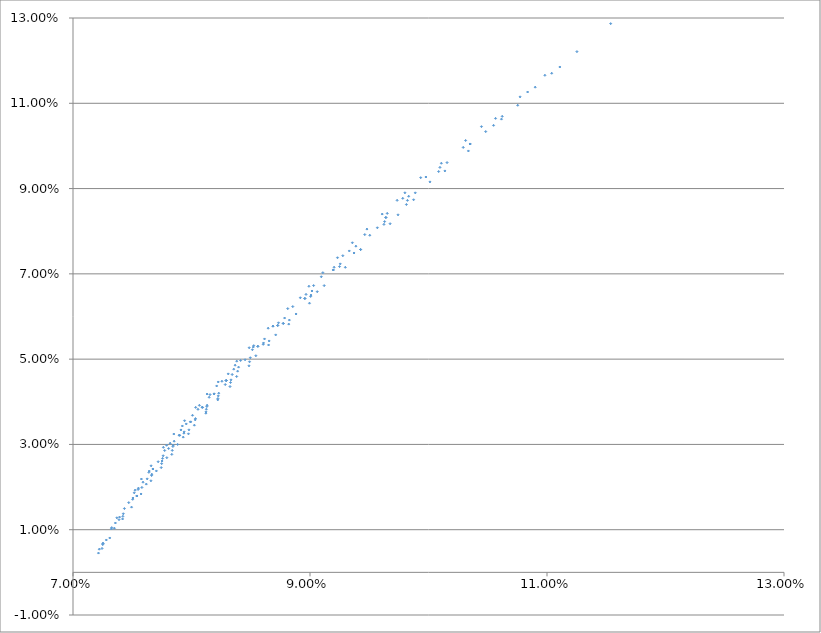
| Category | Series 0 |
|---|---|
| 0.07221803137671154 | 0.005 |
| 0.0735791200367572 | 0.012 |
| 0.07552028197854009 | 0.02 |
| 0.07718873453908365 | 0.026 |
| 0.07898030020854765 | 0.032 |
| 0.08091605244465952 | 0.039 |
| 0.08292923222317293 | 0.045 |
| 0.08559955052498379 | 0.053 |
| 0.08785687628601431 | 0.06 |
| 0.09016665102168002 | 0.066 |
| 0.0925538682814235 | 0.072 |
| 0.0956851513644795 | 0.081 |
| 0.0982251834775792 | 0.087 |
| 0.10085767345029388 | 0.094 |
| 0.10351266446178342 | 0.1 |
| 0.10621898345309852 | 0.107 |
| 0.10900517279856621 | 0.114 |
| 0.11252466352052853 | 0.122 |
| 0.1153722014788285 | 0.129 |
| 0.07370025484647794 | 0.013 |
| 0.07523790695185076 | 0.019 |
| 0.07643460943454886 | 0.024 |
| 0.07820048791999988 | 0.03 |
| 0.07955830275608435 | 0.035 |
| 0.0814910100919578 | 0.041 |
| 0.08356414800455197 | 0.048 |
| 0.08513866202798487 | 0.052 |
| 0.08734204747431258 | 0.059 |
| 0.08966566052469205 | 0.065 |
| 0.09203279358484036 | 0.072 |
| 0.09387397117935728 | 0.076 |
| 0.09640080924605293 | 0.083 |
| 0.09832894268906907 | 0.088 |
| 0.10096438513504438 | 0.095 |
| 0.10293079049773467 | 0.1 |
| 0.10565995192735228 | 0.106 |
| 0.1077294716567385 | 0.112 |
| 0.1098245972002134 | 0.117 |
| 0.07577429735649248 | 0.022 |
| 0.0765913705370415 | 0.025 |
| 0.07789785695700828 | 0.03 |
| 0.07922890091910584 | 0.034 |
| 0.08066739904501186 | 0.039 |
| 0.08212458789663529 | 0.044 |
| 0.08368172390143137 | 0.049 |
| 0.08525212976677096 | 0.053 |
| 0.0868752749928845 | 0.058 |
| 0.08918125915308857 | 0.064 |
| 0.09095396368564156 | 0.069 |
| 0.09276928101870396 | 0.074 |
| 0.09462475868357588 | 0.079 |
| 0.09651808056381067 | 0.084 |
| 0.0978283822948225 | 0.088 |
| 0.0997801285959657 | 0.093 |
| 0.10108507716874801 | 0.096 |
| 0.10313303526148308 | 0.101 |
| 0.1044711180666029 | 0.105 |
| 0.07762836919002912 | 0.029 |
| 0.0785065972284276 | 0.032 |
| 0.07941446811875472 | 0.036 |
| 0.08035097707992081 | 0.039 |
| 0.08131513464126017 | 0.042 |
| 0.08225777514535101 | 0.045 |
| 0.08381613202198505 | 0.05 |
| 0.08486974690097329 | 0.053 |
| 0.08647078761180811 | 0.057 |
| 0.08812271751393963 | 0.062 |
| 0.08991172303373389 | 0.067 |
| 0.09108368700902883 | 0.07 |
| 0.09232087914032343 | 0.074 |
| 0.09357714500786285 | 0.077 |
| 0.09480303758910893 | 0.08 |
| 0.09609404717650007 | 0.084 |
| 0.09735261461067275 | 0.087 |
| 0.09801216268820588 | 0.089 |
| 0.09934315252578962 | 0.093 |
| 0.07281195158697705 | 0.008 |
| 0.07424506718509398 | 0.014 |
| 0.07538380211943205 | 0.018 |
| 0.07663211242399154 | 0.023 |
| 0.07748150996623965 | 0.025 |
| 0.07837773313957458 | 0.029 |
| 0.07930323795699207 | 0.032 |
| 0.08024241270677467 | 0.035 |
| 0.08122343766767222 | 0.038 |
| 0.08223076485731569 | 0.041 |
| 0.08381167556663723 | 0.046 |
| 0.08543229684449268 | 0.051 |
| 0.08710423176610496 | 0.056 |
| 0.08882458276626277 | 0.061 |
| 0.09119574893706758 | 0.067 |
| 0.09427136622233148 | 0.076 |
| 0.09743103528755971 | 0.084 |
| 0.10138314135932378 | 0.094 |
| 0.10752930364870644 | 0.11 |
| 0.07392916725389514 | 0.013 |
| 0.07505728504398959 | 0.017 |
| 0.07626115240513305 | 0.022 |
| 0.07755989074757791 | 0.027 |
| 0.07845603773328615 | 0.03 |
| 0.07938143922701656 | 0.033 |
| 0.08033508426343541 | 0.036 |
| 0.08131597915778319 | 0.039 |
| 0.08284814110398973 | 0.044 |
| 0.0838928950315379 | 0.047 |
| 0.08607807452644506 | 0.054 |
| 0.08774429880609082 | 0.058 |
| 0.09008069029395026 | 0.065 |
| 0.09249564302835578 | 0.072 |
| 0.09623793788526554 | 0.082 |
| 0.10012389952446682 | 0.092 |
| 0.10482797784522795 | 0.103 |
| 0.11108303428648363 | 0.119 |
| 0.07253179456713256 | 0.007 |
| 0.07434043682582969 | 0.015 |
| 0.0754923111517561 | 0.019 |
| 0.07674558274703891 | 0.024 |
| 0.07806964431794973 | 0.029 |
| 0.07898030020854765 | 0.032 |
| 0.07991968537881333 | 0.035 |
| 0.08091605244465952 | 0.039 |
| 0.08190975298289187 | 0.042 |
| 0.08292923222317293 | 0.045 |
| 0.0839735512732821 | 0.048 |
| 0.08559955052498379 | 0.053 |
| 0.08727656186692655 | 0.058 |
| 0.08956623543211258 | 0.064 |
| 0.09196580833979477 | 0.071 |
| 0.09504387313733342 | 0.079 |
| 0.0988859781343461 | 0.089 |
| 0.10351266446178342 | 0.1 |
| 0.11039852633803189 | 0.117 |
| 0.07326667122601342 | 0.01 |
| 0.07516932590640156 | 0.019 |
| 0.07640054826248285 | 0.023 |
| 0.07773841830594592 | 0.029 |
| 0.07911045004680427 | 0.033 |
| 0.08008637541412691 | 0.037 |
| 0.08054721843183132 | 0.038 |
| 0.08156479579621574 | 0.042 |
| 0.08257048822751832 | 0.045 |
| 0.08310230901836488 | 0.047 |
| 0.08414543477653054 | 0.05 |
| 0.08521246655386742 | 0.053 |
| 0.0868752749928845 | 0.058 |
| 0.08854825939041473 | 0.062 |
| 0.09030567889149078 | 0.067 |
| 0.09331729599140057 | 0.075 |
| 0.09640080924605293 | 0.083 |
| 0.101567776988362 | 0.096 |
| 0.07244937093717953 | 0.006 |
| 0.073101629855345 | 0.008 |
| 0.07418372007284155 | 0.013 |
| 0.07494216583512896 | 0.015 |
| 0.07574408876492679 | 0.018 |
| 0.07657842763150263 | 0.021 |
| 0.07744413474958949 | 0.025 |
| 0.078340170210607 | 0.028 |
| 0.07974390561506516 | 0.032 |
| 0.08121076382759561 | 0.037 |
| 0.08221805087255026 | 0.04 |
| 0.0832506903876241 | 0.044 |
| 0.08485131835583382 | 0.048 |
| 0.08650436097694454 | 0.053 |
| 0.08820687146665811 | 0.058 |
| 0.08995604117812822 | 0.063 |
| 0.09297944354139591 | 0.072 |
| 0.09676006487186635 | 0.082 |
| 0.07214970678782745 | 0.005 |
| 0.0734922520745819 | 0.01 |
| 0.07421013444267295 | 0.013 |
| 0.07538380211943205 | 0.018 |
| 0.07618685592991205 | 0.021 |
| 0.07703720442253777 | 0.024 |
| 0.07791838388281433 | 0.027 |
| 0.07882936040267251 | 0.03 |
| 0.07978468965632685 | 0.033 |
| 0.08125462337377444 | 0.038 |
| 0.08226195932123924 | 0.041 |
| 0.08329463317669146 | 0.045 |
| 0.08489808083865631 | 0.049 |
| 0.08655380874770323 | 0.054 |
| 0.08825887463581474 | 0.059 |
| 0.09061132150082399 | 0.066 |
| 0.09427136622233148 | 0.076 |
| 0.09874160993807535 | 0.087 |
| 0.10615762003821286 | 0.106 |
| 0.07250792317538592 | 0.007 |
| 0.07388359213467498 | 0.012 |
| 0.07503452234899075 | 0.017 |
| 0.07581608694989606 | 0.02 |
| 0.07665069020761858 | 0.023 |
| 0.07751662667537529 | 0.026 |
| 0.0784334420014358 | 0.03 |
| 0.07935890451923516 | 0.033 |
| 0.08031261707670004 | 0.036 |
| 0.08129358541631226 | 0.039 |
| 0.08230083493431256 | 0.042 |
| 0.08333341265570317 | 0.045 |
| 0.0849615855670889 | 0.05 |
| 0.08605332091377962 | 0.053 |
| 0.08774429880609082 | 0.058 |
| 0.09005553365307681 | 0.065 |
| 0.09371686746795409 | 0.075 |
| 0.0981358311560092 | 0.086 |
| 0.10549104156708788 | 0.105 |
| 0.0732384978641129 | 0.01 |
| 0.07470677380423996 | 0.016 |
| 0.07591117614483209 | 0.021 |
| 0.07674558274703891 | 0.024 |
| 0.0776112885577126 | 0.027 |
| 0.07853587893694225 | 0.031 |
| 0.07898030020854765 | 0.032 |
| 0.07991968537881333 | 0.035 |
| 0.08091605244465952 | 0.039 |
| 0.08190975298289187 | 0.042 |
| 0.08292923222317293 | 0.045 |
| 0.08343368512750043 | 0.046 |
| 0.08451977565672104 | 0.05 |
| 0.08616331505692824 | 0.055 |
| 0.08727656186692655 | 0.058 |
| 0.08956623543211258 | 0.064 |
| 0.09196580833979477 | 0.071 |
| 0.09629818876535673 | 0.082 |
| 0.10351266446178342 | 0.1 |
| 0.07253179456713256 | 0.007 |
| 0.10836406290110347 | 0.113 |
| 0.10336820992710993 | 0.099 |